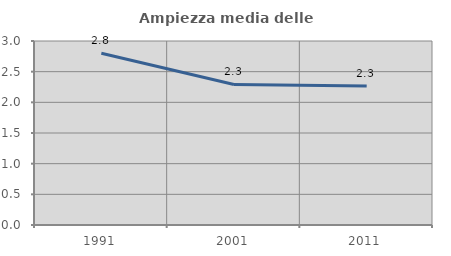
| Category | Ampiezza media delle famiglie |
|---|---|
| 1991.0 | 2.8 |
| 2001.0 | 2.291 |
| 2011.0 | 2.267 |